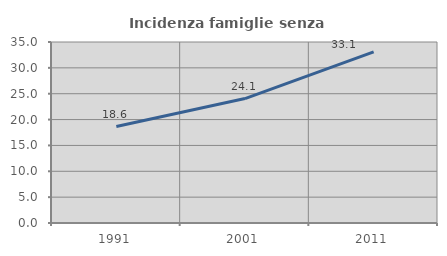
| Category | Incidenza famiglie senza nuclei |
|---|---|
| 1991.0 | 18.65 |
| 2001.0 | 24.062 |
| 2011.0 | 33.074 |